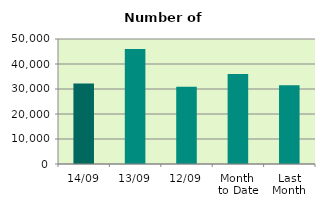
| Category | Series 0 |
|---|---|
| 14/09 | 32200 |
| 13/09 | 46018 |
| 12/09 | 30918 |
| Month 
to Date | 35988.8 |
| Last
Month | 31456 |